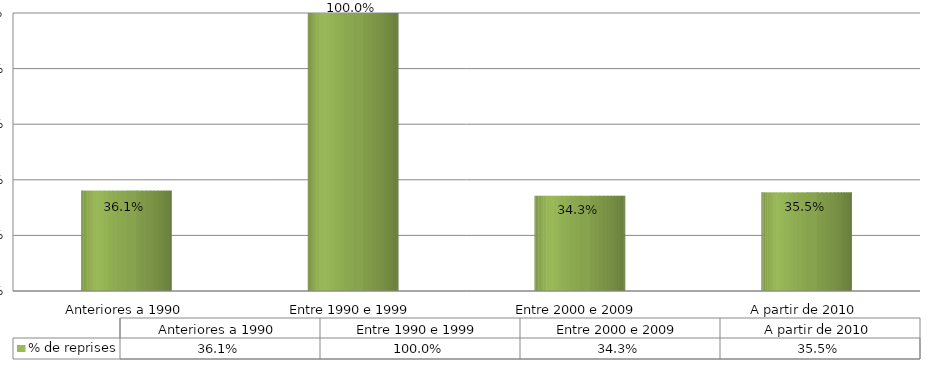
| Category | % de reprises |
|---|---|
| Anteriores a 1990 | 0.361 |
| Entre 1990 e 1999 | 1 |
| Entre 2000 e 2009 | 0.343 |
| A partir de 2010 | 0.355 |